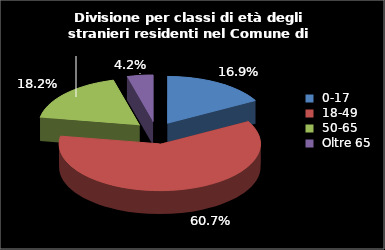
| Category | Series 0 |
|---|---|
| 0-17 | 93 |
| 18-49 | 334 |
| 50-65 | 100 |
| Oltre 65 | 23 |